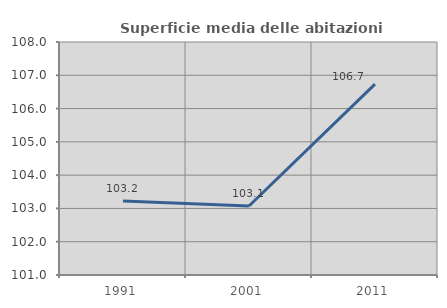
| Category | Superficie media delle abitazioni occupate |
|---|---|
| 1991.0 | 103.227 |
| 2001.0 | 103.073 |
| 2011.0 | 106.733 |